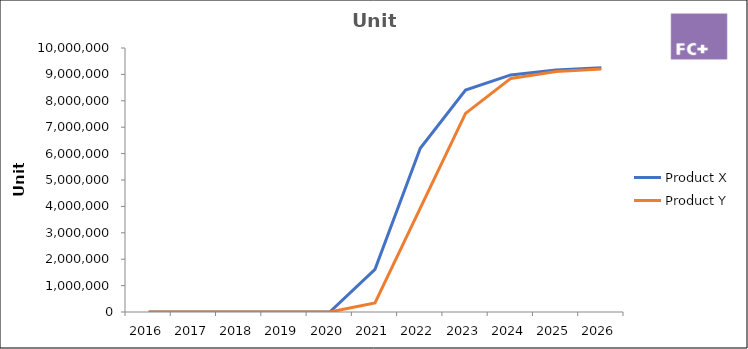
| Category | Product X | Product Y |
|---|---|---|
| 2016.0 | 0 | 0 |
| 2017.0 | 0 | 0 |
| 2018.0 | 0 | 0 |
| 2019.0 | 0 | 0 |
| 2020.0 | 0 | 0 |
| 2021.0 | 1614698.951 | 341229.216 |
| 2022.0 | 6200511.244 | 3932916.919 |
| 2023.0 | 8410480.135 | 7524672.316 |
| 2024.0 | 8981313.833 | 8847132.851 |
| 2025.0 | 9162766.308 | 9110537.885 |
| 2026.0 | 9254393.972 | 9201643.263 |